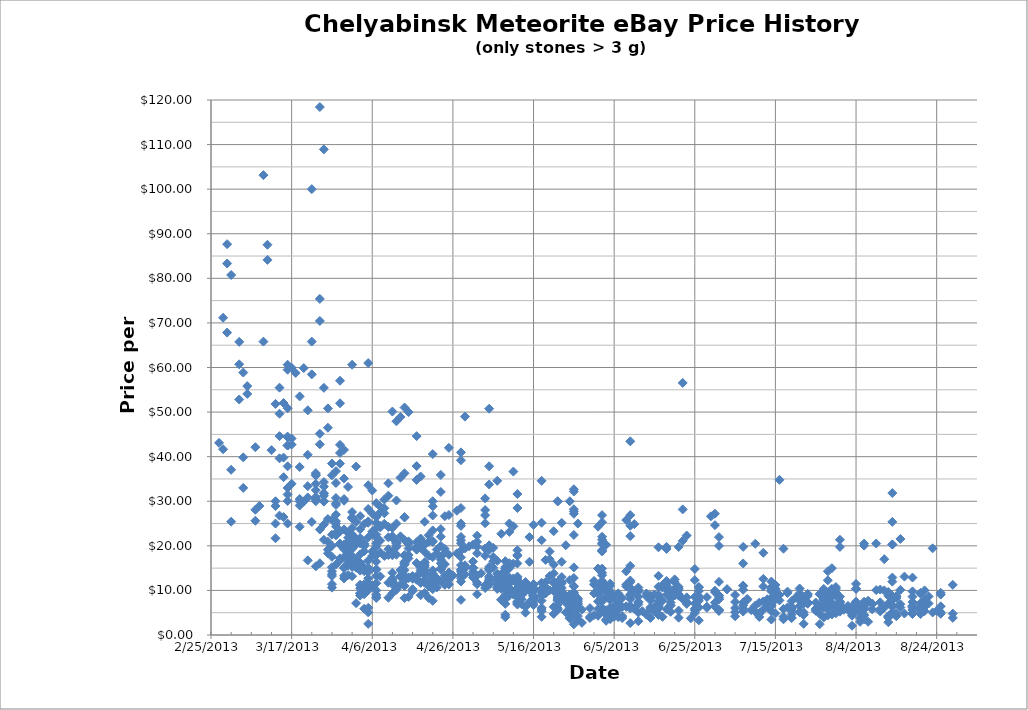
| Category | Series 0 |
|---|---|
| 41332.0 | 43.097 |
| 41333.0 | 71.156 |
| 41333.0 | 41.667 |
| 41334.0 | 83.333 |
| 41334.0 | 67.832 |
| 41334.0 | 87.663 |
| 41335.0 | 25.417 |
| 41335.0 | 37.064 |
| 41335.0 | 80.75 |
| 41337.0 | 52.827 |
| 41337.0 | 60.714 |
| 41337.0 | 65.748 |
| 41338.0 | 33 |
| 41338.0 | 39.845 |
| 41338.0 | 58.875 |
| 41339.0 | 55.833 |
| 41339.0 | 54.07 |
| 41341.0 | 42.125 |
| 41341.0 | 25.625 |
| 41341.0 | 28.083 |
| 41342.0 | 28.947 |
| 41343.0 | 103.148 |
| 41343.0 | 65.811 |
| 41344.0 | 84.142 |
| 41344.0 | 87.527 |
| 41345.0 | 41.46 |
| 41346.0 | 51.829 |
| 41346.0 | 21.696 |
| 41346.0 | 28.929 |
| 41346.0 | 25 |
| 41346.0 | 30 |
| 41347.0 | 39.634 |
| 41347.0 | 49.634 |
| 41347.0 | 44.603 |
| 41347.0 | 55.475 |
| 41347.0 | 26.782 |
| 41348.0 | 39.795 |
| 41348.0 | 26.452 |
| 41348.0 | 52.029 |
| 41348.0 | 35.395 |
| 41349.0 | 59.504 |
| 41349.0 | 30.065 |
| 41349.0 | 33 |
| 41349.0 | 44.5 |
| 41349.0 | 31.512 |
| 41349.0 | 50.85 |
| 41349.0 | 60.625 |
| 41349.0 | 42.5 |
| 41349.0 | 37.833 |
| 41349.0 | 44.375 |
| 41349.0 | 24.997 |
| 41349.0 | 42.5 |
| 41350.0 | 59.948 |
| 41350.0 | 33.919 |
| 41350.0 | 44.071 |
| 41350.0 | 42.71 |
| 41351.0 | 58.786 |
| 41352.0 | 29.046 |
| 41352.0 | 37.677 |
| 41352.0 | 30.5 |
| 41352.0 | 53.517 |
| 41352.0 | 29.96 |
| 41352.0 | 24.283 |
| 41353.0 | 59.859 |
| 41353.0 | 29.93 |
| 41354.0 | 16.735 |
| 41354.0 | 33.384 |
| 41354.0 | 40.423 |
| 41354.0 | 50.403 |
| 41354.0 | 30.849 |
| 41355.0 | 100 |
| 41355.0 | 65.809 |
| 41355.0 | 25.357 |
| 41355.0 | 58.462 |
| 41356.0 | 30.333 |
| 41356.0 | 35.901 |
| 41356.0 | 30.643 |
| 41356.0 | 30.011 |
| 41356.0 | 33.889 |
| 41356.0 | 30.964 |
| 41356.0 | 35.763 |
| 41356.0 | 32.5 |
| 41356.0 | 36.31 |
| 41356.0 | 15.4 |
| 41357.0 | 16.095 |
| 41357.0 | 23.65 |
| 41357.0 | 70.442 |
| 41357.0 | 75.392 |
| 41357.0 | 45.133 |
| 41357.0 | 118.421 |
| 41357.0 | 42.764 |
| 41358.0 | 29.923 |
| 41358.0 | 31.794 |
| 41358.0 | 33.291 |
| 41358.0 | 30.033 |
| 41358.0 | 21.357 |
| 41358.0 | 34.299 |
| 41358.0 | 55.435 |
| 41358.0 | 108.929 |
| 41358.0 | 31.231 |
| 41358.0 | 24.771 |
| 41358.0 | 31.786 |
| 41359.0 | 26.012 |
| 41359.0 | 50.821 |
| 41359.0 | 46.49 |
| 41359.0 | 19.131 |
| 41359.0 | 20.918 |
| 41359.0 | 18.316 |
| 41360.0 | 22.497 |
| 41360.0 | 38.462 |
| 41360.0 | 25.82 |
| 41360.0 | 11.404 |
| 41360.0 | 13.233 |
| 41360.0 | 35.823 |
| 41360.0 | 20 |
| 41360.0 | 17.537 |
| 41360.0 | 14.315 |
| 41360.0 | 10.625 |
| 41360.0 | 15.205 |
| 41360.0 | 13.651 |
| 41361.0 | 15.803 |
| 41361.0 | 29.167 |
| 41361.0 | 22.353 |
| 41361.0 | 25.521 |
| 41361.0 | 36.759 |
| 41361.0 | 22.917 |
| 41361.0 | 30.729 |
| 41361.0 | 26.984 |
| 41361.0 | 34.091 |
| 41361.0 | 24.309 |
| 41361.0 | 29.545 |
| 41361.0 | 25 |
| 41362.0 | 57.029 |
| 41362.0 | 38.441 |
| 41362.0 | 42.653 |
| 41362.0 | 23.211 |
| 41362.0 | 17.178 |
| 41362.0 | 40.831 |
| 41362.0 | 20.523 |
| 41362.0 | 20.478 |
| 41362.0 | 16.765 |
| 41362.0 | 20.255 |
| 41362.0 | 51.979 |
| 41363.0 | 30.5 |
| 41363.0 | 41.518 |
| 41363.0 | 13.275 |
| 41363.0 | 23.707 |
| 41363.0 | 15.196 |
| 41363.0 | 30.116 |
| 41363.0 | 12.68 |
| 41363.0 | 15 |
| 41363.0 | 20.303 |
| 41363.0 | 19.25 |
| 41363.0 | 35.093 |
| 41363.0 | 17.5 |
| 41364.0 | 16.85 |
| 41364.0 | 18.671 |
| 41364.0 | 13.453 |
| 41364.0 | 20.314 |
| 41364.0 | 22.908 |
| 41364.0 | 20.938 |
| 41364.0 | 16.125 |
| 41364.0 | 17.895 |
| 41364.0 | 20.414 |
| 41364.0 | 21.817 |
| 41364.0 | 20.413 |
| 41364.0 | 18.286 |
| 41364.0 | 19.052 |
| 41364.0 | 33.213 |
| 41364.0 | 15.633 |
| 41364.0 | 18.91 |
| 41365.0 | 26.279 |
| 41365.0 | 60.625 |
| 41365.0 | 22.586 |
| 41365.0 | 19.304 |
| 41365.0 | 26.122 |
| 41365.0 | 19.907 |
| 41365.0 | 24 |
| 41365.0 | 13.188 |
| 41365.0 | 26.412 |
| 41365.0 | 15.25 |
| 41365.0 | 17.75 |
| 41365.0 | 16.538 |
| 41365.0 | 20.278 |
| 41365.0 | 21.643 |
| 41365.0 | 27.579 |
| 41366.0 | 15.435 |
| 41366.0 | 15.082 |
| 41366.0 | 37.791 |
| 41366.0 | 25.352 |
| 41366.0 | 21.602 |
| 41366.0 | 20.335 |
| 41366.0 | 16.886 |
| 41366.0 | 20.297 |
| 41366.0 | 7.143 |
| 41367.0 | 20.538 |
| 41367.0 | 16.233 |
| 41367.0 | 15.2 |
| 41367.0 | 9.317 |
| 41367.0 | 21.769 |
| 41367.0 | 26.67 |
| 41367.0 | 10.469 |
| 41367.0 | 14.449 |
| 41367.0 | 15.278 |
| 41367.0 | 11.203 |
| 41367.0 | 11.236 |
| 41367.0 | 9.42 |
| 41367.0 | 23.72 |
| 41367.0 | 8.842 |
| 41367.0 | 15 |
| 41367.0 | 18.108 |
| 41368.0 | 18.788 |
| 41368.0 | 24.905 |
| 41368.0 | 15.174 |
| 41368.0 | 19.936 |
| 41368.0 | 10.774 |
| 41368.0 | 9.15 |
| 41368.0 | 14.315 |
| 41368.0 | 10.311 |
| 41368.0 | 11.375 |
| 41368.0 | 10.222 |
| 41368.0 | 10.156 |
| 41368.0 | 14.886 |
| 41368.0 | 20.278 |
| 41368.0 | 9.875 |
| 41368.0 | 10.375 |
| 41368.0 | 20.5 |
| 41368.0 | 20.437 |
| 41368.0 | 5.908 |
| 41369.0 | 10.062 |
| 41369.0 | 2.5 |
| 41369.0 | 10.964 |
| 41369.0 | 10.235 |
| 41369.0 | 15.057 |
| 41369.0 | 5.069 |
| 41369.0 | 6.102 |
| 41369.0 | 11 |
| 41369.0 | 14.167 |
| 41369.0 | 16.667 |
| 41369.0 | 61 |
| 41369.0 | 21.867 |
| 41369.0 | 28.261 |
| 41369.0 | 25.49 |
| 41369.0 | 33.596 |
| 41369.0 | 25.183 |
| 41369.0 | 11.722 |
| 41369.0 | 12.715 |
| 41370.0 | 27.256 |
| 41370.0 | 22.754 |
| 41370.0 | 18.738 |
| 41370.0 | 32.409 |
| 41370.0 | 23.193 |
| 41370.0 | 17.758 |
| 41370.0 | 11.062 |
| 41371.0 | 10 |
| 41371.0 | 8.303 |
| 41371.0 | 8.471 |
| 41371.0 | 9.022 |
| 41371.0 | 26.473 |
| 41371.0 | 20.571 |
| 41371.0 | 19.834 |
| 41371.0 | 22.53 |
| 41371.0 | 17.888 |
| 41371.0 | 16.459 |
| 41371.0 | 14.643 |
| 41371.0 | 13.212 |
| 41371.0 | 29.588 |
| 41371.0 | 25.142 |
| 41371.0 | 17.988 |
| 41371.0 | 14.749 |
| 41371.0 | 11.61 |
| 41371.0 | 21.872 |
| 41371.0 | 24.008 |
| 41372.0 | 18.495 |
| 41372.0 | 24.135 |
| 41372.0 | 27.5 |
| 41372.0 | 13.151 |
| 41372.0 | 21.163 |
| 41372.0 | 24.479 |
| 41372.0 | 28.78 |
| 41373.0 | 30.375 |
| 41373.0 | 28.425 |
| 41373.0 | 17.708 |
| 41373.0 | 24.943 |
| 41373.0 | 27.292 |
| 41374.0 | 17.933 |
| 41374.0 | 8.361 |
| 41374.0 | 11.724 |
| 41374.0 | 21.905 |
| 41374.0 | 19.248 |
| 41374.0 | 24.222 |
| 41374.0 | 31.25 |
| 41374.0 | 34.016 |
| 41375.0 | 17.884 |
| 41375.0 | 11.95 |
| 41375.0 | 18.726 |
| 41375.0 | 21.779 |
| 41375.0 | 12.054 |
| 41375.0 | 11.345 |
| 41375.0 | 9.368 |
| 41375.0 | 13.963 |
| 41375.0 | 12.701 |
| 41375.0 | 12.379 |
| 41375.0 | 24.034 |
| 41375.0 | 22.162 |
| 41375.0 | 50.115 |
| 41376.0 | 24.997 |
| 41376.0 | 19.759 |
| 41376.0 | 10.147 |
| 41376.0 | 18.011 |
| 41376.0 | 47.939 |
| 41376.0 | 20 |
| 41376.0 | 30.178 |
| 41376.0 | 20.67 |
| 41376.0 | 20.492 |
| 41376.0 | 10.925 |
| 41376.0 | 20.842 |
| 41377.0 | 48.918 |
| 41377.0 | 13.247 |
| 41377.0 | 14.578 |
| 41377.0 | 22.126 |
| 41377.0 | 13.2 |
| 41377.0 | 13.059 |
| 41377.0 | 11.305 |
| 41377.0 | 35.298 |
| 41378.0 | 16.232 |
| 41378.0 | 15.995 |
| 41378.0 | 13.02 |
| 41378.0 | 13.199 |
| 41378.0 | 12.201 |
| 41378.0 | 12.972 |
| 41378.0 | 26.357 |
| 41378.0 | 51.026 |
| 41378.0 | 36.273 |
| 41378.0 | 21.282 |
| 41378.0 | 14.54 |
| 41378.0 | 16.416 |
| 41378.0 | 17.794 |
| 41378.0 | 17.916 |
| 41378.0 | 26.462 |
| 41378.0 | 11.01 |
| 41378.0 | 12.727 |
| 41378.0 | 8.271 |
| 41378.0 | 15.769 |
| 41379.0 | 20.368 |
| 41379.0 | 12.932 |
| 41379.0 | 50 |
| 41379.0 | 17.188 |
| 41379.0 | 12.766 |
| 41379.0 | 21.006 |
| 41379.0 | 17.965 |
| 41379.0 | 8.553 |
| 41379.0 | 19.403 |
| 41380.0 | 12.617 |
| 41380.0 | 13.224 |
| 41380.0 | 12.888 |
| 41380.0 | 10.275 |
| 41380.0 | 9.834 |
| 41381.0 | 12.384 |
| 41381.0 | 19.375 |
| 41381.0 | 19.141 |
| 41381.0 | 44.604 |
| 41381.0 | 37.88 |
| 41381.0 | 19.722 |
| 41381.0 | 16.139 |
| 41381.0 | 20.806 |
| 41381.0 | 13.194 |
| 41381.0 | 34.785 |
| 41382.0 | 11.687 |
| 41382.0 | 8.913 |
| 41382.0 | 15.461 |
| 41382.0 | 19.578 |
| 41382.0 | 35.549 |
| 41382.0 | 15.102 |
| 41382.0 | 14.006 |
| 41382.0 | 11.865 |
| 41382.0 | 14.519 |
| 41382.0 | 21.638 |
| 41382.0 | 21.364 |
| 41383.0 | 16.327 |
| 41383.0 | 9.438 |
| 41383.0 | 16.129 |
| 41383.0 | 25.407 |
| 41383.0 | 18.644 |
| 41383.0 | 20.267 |
| 41383.0 | 11.713 |
| 41383.0 | 14.575 |
| 41383.0 | 13.479 |
| 41383.0 | 15.224 |
| 41383.0 | 13.837 |
| 41383.0 | 12.35 |
| 41383.0 | 15.625 |
| 41383.0 | 14.069 |
| 41384.0 | 17.747 |
| 41384.0 | 10.937 |
| 41384.0 | 12.059 |
| 41384.0 | 22.364 |
| 41384.0 | 8.3 |
| 41384.0 | 20.92 |
| 41385.0 | 23.462 |
| 41385.0 | 20.882 |
| 41385.0 | 7.666 |
| 41385.0 | 11.978 |
| 41385.0 | 12.55 |
| 41385.0 | 12.963 |
| 41385.0 | 10.288 |
| 41385.0 | 40.587 |
| 41385.0 | 28.862 |
| 41385.0 | 14.497 |
| 41385.0 | 13.137 |
| 41385.0 | 13.772 |
| 41385.0 | 21.078 |
| 41385.0 | 11.895 |
| 41385.0 | 13.043 |
| 41385.0 | 13.667 |
| 41385.0 | 26.806 |
| 41385.0 | 17.447 |
| 41385.0 | 29.997 |
| 41386.0 | 10.654 |
| 41386.0 | 18.25 |
| 41386.0 | 19.169 |
| 41386.0 | 12.727 |
| 41386.0 | 11.818 |
| 41387.0 | 14.783 |
| 41387.0 | 12.109 |
| 41387.0 | 22.051 |
| 41387.0 | 14.935 |
| 41387.0 | 14.696 |
| 41387.0 | 20 |
| 41387.0 | 16.082 |
| 41387.0 | 35.901 |
| 41387.0 | 32.094 |
| 41387.0 | 16.918 |
| 41387.0 | 23.75 |
| 41387.0 | 17.548 |
| 41388.0 | 26.645 |
| 41388.0 | 15.882 |
| 41388.0 | 19.318 |
| 41388.0 | 18.485 |
| 41388.0 | 13.357 |
| 41388.0 | 11.25 |
| 41389.0 | 41.975 |
| 41389.0 | 14 |
| 41389.0 | 12.465 |
| 41389.0 | 26.909 |
| 41389.0 | 11.349 |
| 41389.0 | 18 |
| 41390.0 | 13.34 |
| 41391.0 | 27.857 |
| 41391.0 | 18.319 |
| 41392.0 | 11.987 |
| 41392.0 | 13.25 |
| 41392.0 | 12.751 |
| 41392.0 | 21.995 |
| 41392.0 | 20.572 |
| 41392.0 | 17.433 |
| 41392.0 | 14.604 |
| 41392.0 | 14.225 |
| 41392.0 | 28.489 |
| 41392.0 | 39.2 |
| 41392.0 | 25.017 |
| 41392.0 | 40.963 |
| 41392.0 | 24.47 |
| 41392.0 | 18.91 |
| 41392.0 | 21.259 |
| 41392.0 | 7.879 |
| 41392.0 | 13.551 |
| 41392.0 | 14.67 |
| 41392.0 | 15.676 |
| 41393.0 | 48.991 |
| 41393.0 | 13.622 |
| 41393.0 | 14.981 |
| 41393.0 | 19.424 |
| 41393.0 | 15.636 |
| 41394.0 | 19.9 |
| 41395.0 | 15 |
| 41395.0 | 15.135 |
| 41395.0 | 13.519 |
| 41395.0 | 20.256 |
| 41395.0 | 16.483 |
| 41395.0 | 13.514 |
| 41395.0 | 14.179 |
| 41395.0 | 12.925 |
| 41395.0 | 15.094 |
| 41396.0 | 11.39 |
| 41396.0 | 22.273 |
| 41396.0 | 11.731 |
| 41396.0 | 13.333 |
| 41396.0 | 9.142 |
| 41396.0 | 18.333 |
| 41396.0 | 20.895 |
| 41396.0 | 19.785 |
| 41397.0 | 13.846 |
| 41398.0 | 30.632 |
| 41398.0 | 26.882 |
| 41398.0 | 11.149 |
| 41398.0 | 17.759 |
| 41398.0 | 25.069 |
| 41398.0 | 28.035 |
| 41398.0 | 19.403 |
| 41398.0 | 10.526 |
| 41399.0 | 20 |
| 41399.0 | 14.966 |
| 41399.0 | 14.523 |
| 41399.0 | 14.796 |
| 41399.0 | 13.146 |
| 41399.0 | 12.785 |
| 41399.0 | 11.465 |
| 41399.0 | 11.243 |
| 41399.0 | 12.365 |
| 41399.0 | 19.918 |
| 41399.0 | 12.182 |
| 41399.0 | 11.538 |
| 41399.0 | 15.271 |
| 41399.0 | 11.94 |
| 41399.0 | 19.103 |
| 41399.0 | 37.846 |
| 41399.0 | 20.123 |
| 41399.0 | 33.768 |
| 41399.0 | 50.758 |
| 41400.0 | 19.551 |
| 41400.0 | 16.552 |
| 41400.0 | 15.091 |
| 41400.0 | 17.5 |
| 41401.0 | 11.469 |
| 41401.0 | 10.326 |
| 41401.0 | 13.75 |
| 41401.0 | 34.594 |
| 41401.0 | 12.989 |
| 41401.0 | 12.44 |
| 41401.0 | 11.486 |
| 41401.0 | 16.613 |
| 41401.0 | 10.7 |
| 41402.0 | 22.695 |
| 41402.0 | 7.857 |
| 41402.0 | 11.8 |
| 41402.0 | 7.94 |
| 41402.0 | 11.383 |
| 41402.0 | 12.502 |
| 41402.0 | 13.725 |
| 41402.0 | 10.515 |
| 41402.0 | 11.619 |
| 41402.0 | 10.355 |
| 41403.0 | 10.497 |
| 41403.0 | 6.985 |
| 41403.0 | 7.972 |
| 41403.0 | 8.976 |
| 41403.0 | 10.304 |
| 41403.0 | 10.144 |
| 41403.0 | 3.988 |
| 41403.0 | 11.44 |
| 41403.0 | 14.306 |
| 41403.0 | 16.552 |
| 41403.0 | 13.362 |
| 41403.0 | 8.409 |
| 41403.0 | 8.414 |
| 41403.0 | 14.876 |
| 41403.0 | 12.835 |
| 41403.0 | 15.264 |
| 41403.0 | 12.56 |
| 41403.0 | 4.55 |
| 41404.0 | 10.278 |
| 41404.0 | 12.909 |
| 41404.0 | 8.85 |
| 41404.0 | 15.507 |
| 41404.0 | 16.105 |
| 41404.0 | 23.119 |
| 41404.0 | 10.32 |
| 41404.0 | 14.955 |
| 41404.0 | 10.612 |
| 41404.0 | 11.559 |
| 41404.0 | 25 |
| 41405.0 | 36.649 |
| 41405.0 | 24.374 |
| 41405.0 | 16.021 |
| 41405.0 | 9.07 |
| 41405.0 | 9.572 |
| 41405.0 | 12.691 |
| 41406.0 | 7.323 |
| 41406.0 | 12.285 |
| 41406.0 | 12.269 |
| 41406.0 | 8.7 |
| 41406.0 | 9.491 |
| 41406.0 | 17.761 |
| 41406.0 | 13.098 |
| 41406.0 | 31.617 |
| 41406.0 | 9.63 |
| 41406.0 | 11.887 |
| 41406.0 | 9.48 |
| 41406.0 | 19.01 |
| 41406.0 | 17.949 |
| 41406.0 | 28.482 |
| 41406.0 | 8.488 |
| 41406.0 | 11.512 |
| 41406.0 | 10.515 |
| 41406.0 | 16.05 |
| 41406.0 | 10.182 |
| 41406.0 | 12.746 |
| 41406.0 | 11.566 |
| 41406.0 | 6.842 |
| 41406.0 | 7.5 |
| 41406.0 | 9.919 |
| 41406.0 | 10.127 |
| 41406.0 | 10.411 |
| 41406.0 | 6.98 |
| 41407.0 | 10.151 |
| 41407.0 | 8.89 |
| 41407.0 | 6.923 |
| 41407.0 | 10.167 |
| 41407.0 | 11.325 |
| 41407.0 | 7.963 |
| 41408.0 | 10.373 |
| 41407.0 | 8.009 |
| 41408.0 | 9.819 |
| 41408.0 | 11.858 |
| 41408.0 | 6.32 |
| 41408.0 | 10.375 |
| 41408.0 | 9.939 |
| 41408.0 | 11.814 |
| 41408.0 | 5 |
| 41409.0 | 16.42 |
| 41409.0 | 21.958 |
| 41409.0 | 7.365 |
| 41409.0 | 10.556 |
| 41409.0 | 10.678 |
| 41409.0 | 10.826 |
| 41409.0 | 9.97 |
| 41410.0 | 24.719 |
| 41410.0 | 8.836 |
| 41410.0 | 9.933 |
| 41410.0 | 8.617 |
| 41410.0 | 8.224 |
| 41410.0 | 7.259 |
| 41410.0 | 6.709 |
| 41410.0 | 8.022 |
| 41410.0 | 7.902 |
| 41410.0 | 10.099 |
| 41410.0 | 11.297 |
| 41410.0 | 10.577 |
| 41410.0 | 8.83 |
| 41410.0 | 11.386 |
| 41410.0 | 8.252 |
| 41410.0 | 10.385 |
| 41412.0 | 25.191 |
| 41412.0 | 34.58 |
| 41412.0 | 9.593 |
| 41412.0 | 9.529 |
| 41412.0 | 5.832 |
| 41412.0 | 7.71 |
| 41412.0 | 10.392 |
| 41412.0 | 10.225 |
| 41412.0 | 21.25 |
| 41412.0 | 4.076 |
| 41412.0 | 8.77 |
| 41412.0 | 6.11 |
| 41412.0 | 5.334 |
| 41412.0 | 11.724 |
| 41413.0 | 16.842 |
| 41413.0 | 10.125 |
| 41413.0 | 10.469 |
| 41413.0 | 11.857 |
| 41413.0 | 9.41 |
| 41413.0 | 9.338 |
| 41413.0 | 10.694 |
| 41414.0 | 13.223 |
| 41414.0 | 10.028 |
| 41414.0 | 18.726 |
| 41414.0 | 17 |
| 41415.0 | 9.866 |
| 41415.0 | 12.017 |
| 41415.0 | 13.814 |
| 41415.0 | 15.787 |
| 41415.0 | 11.676 |
| 41415.0 | 10.15 |
| 41415.0 | 4.724 |
| 41415.0 | 6.302 |
| 41415.0 | 23.273 |
| 41416.0 | 7.713 |
| 41416.0 | 30 |
| 41416.0 | 10.168 |
| 41416.0 | 11.758 |
| 41416.0 | 11.875 |
| 41416.0 | 10.294 |
| 41416.0 | 9.875 |
| 41416.0 | 10.08 |
| 41416.0 | 5.641 |
| 41416.0 | 6.749 |
| 41416.0 | 8.305 |
| 41416.0 | 9.237 |
| 41416.0 | 8.523 |
| 41416.0 | 29.959 |
| 41416.0 | 9.276 |
| 41416.0 | 7.911 |
| 41416.0 | 11.706 |
| 41416.0 | 6 |
| 41416.0 | 8.296 |
| 41417.0 | 25.147 |
| 41417.0 | 16.41 |
| 41417.0 | 9.031 |
| 41417.0 | 11.86 |
| 41417.0 | 9.581 |
| 41417.0 | 9.737 |
| 41417.0 | 8.417 |
| 41417.0 | 11.589 |
| 41417.0 | 13 |
| 41417.0 | 10.545 |
| 41417.0 | 8.049 |
| 41417.0 | 9.473 |
| 41418.0 | 5.071 |
| 41418.0 | 20.136 |
| 41418.0 | 8.74 |
| 41418.0 | 7.243 |
| 41418.0 | 7.335 |
| 41419.0 | 8.884 |
| 41419.0 | 6.664 |
| 41419.0 | 7.454 |
| 41419.0 | 8.53 |
| 41419.0 | 12.313 |
| 41419.0 | 6.124 |
| 41419.0 | 9.054 |
| 41419.0 | 7.679 |
| 41419.0 | 4.745 |
| 41419.0 | 5.469 |
| 41419.0 | 3.706 |
| 41419.0 | 5.065 |
| 41419.0 | 3.77 |
| 41419.0 | 30 |
| 41420.0 | 2.383 |
| 41420.0 | 7.482 |
| 41420.0 | 7.473 |
| 41420.0 | 8.962 |
| 41420.0 | 9.351 |
| 41420.0 | 10.971 |
| 41420.0 | 9.583 |
| 41420.0 | 7.361 |
| 41420.0 | 7.265 |
| 41420.0 | 10.887 |
| 41420.0 | 15.159 |
| 41420.0 | 4.714 |
| 41420.0 | 27.715 |
| 41420.0 | 27.204 |
| 41420.0 | 28.218 |
| 41420.0 | 22.449 |
| 41420.0 | 32.187 |
| 41420.0 | 32.691 |
| 41420.0 | 12.788 |
| 41421.0 | 8.192 |
| 41421.0 | 24.991 |
| 41421.0 | 3.438 |
| 41421.0 | 4.234 |
| 41421.0 | 5.987 |
| 41421.0 | 6.006 |
| 41421.0 | 6.933 |
| 41421.0 | 7.875 |
| 41421.0 | 7.102 |
| 41421.0 | 7.517 |
| 41422.0 | 2.735 |
| 41422.0 | 5.68 |
| 41424.0 | 6.028 |
| 41424.0 | 4.062 |
| 41424.0 | 3.81 |
| 41425.0 | 4.472 |
| 41425.0 | 9.325 |
| 41425.0 | 12.129 |
| 41425.0 | 11.364 |
| 41426.0 | 4.312 |
| 41426.0 | 24.291 |
| 41426.0 | 7.551 |
| 41426.0 | 9.18 |
| 41426.0 | 10.127 |
| 41426.0 | 14.902 |
| 41426.0 | 5.826 |
| 41427.0 | 7.799 |
| 41427.0 | 10.967 |
| 41427.0 | 7.969 |
| 41427.0 | 6.088 |
| 41427.0 | 7.5 |
| 41427.0 | 25.294 |
| 41427.0 | 13.956 |
| 41427.0 | 26.887 |
| 41427.0 | 22.04 |
| 41427.0 | 5.366 |
| 41427.0 | 10.693 |
| 41427.0 | 11.869 |
| 41427.0 | 10.658 |
| 41427.0 | 11.088 |
| 41427.0 | 14.886 |
| 41427.0 | 10.032 |
| 41427.0 | 11.957 |
| 41427.0 | 21.362 |
| 41427.0 | 20.4 |
| 41427.0 | 18.75 |
| 41427.0 | 20.614 |
| 41427.0 | 13.408 |
| 41427.0 | 18.943 |
| 41427.0 | 19.034 |
| 41427.0 | 12.127 |
| 41427.0 | 11.544 |
| 41428.0 | 10.384 |
| 41428.0 | 10.33 |
| 41428.0 | 10.884 |
| 41428.0 | 4.58 |
| 41428.0 | 20.227 |
| 41428.0 | 3.443 |
| 41428.0 | 3.184 |
| 41428.0 | 5.552 |
| 41428.0 | 8.585 |
| 41428.0 | 9.69 |
| 41429.0 | 8 |
| 41429.0 | 11.518 |
| 41429.0 | 8.698 |
| 41429.0 | 7.854 |
| 41429.0 | 11.038 |
| 41429.0 | 9.84 |
| 41429.0 | 5 |
| 41429.0 | 9.105 |
| 41429.0 | 3.661 |
| 41429.0 | 3.583 |
| 41429.0 | 6.114 |
| 41430.0 | 4.077 |
| 41430.0 | 5.078 |
| 41430.0 | 5.73 |
| 41430.0 | 6.468 |
| 41430.0 | 8.571 |
| 41431.0 | 5.684 |
| 41431.0 | 9.333 |
| 41431.0 | 6.491 |
| 41431.0 | 5.76 |
| 41431.0 | 6.014 |
| 41431.0 | 7.21 |
| 41431.0 | 7.416 |
| 41431.0 | 6.042 |
| 41431.0 | 4.013 |
| 41432.0 | 6.287 |
| 41432.0 | 3.804 |
| 41432.0 | 4.248 |
| 41432.0 | 8.294 |
| 41433.0 | 10.913 |
| 41433.0 | 6.431 |
| 41433.0 | 25.789 |
| 41433.0 | 11.299 |
| 41433.0 | 14.279 |
| 41433.0 | 6.317 |
| 41434.0 | 2.679 |
| 41434.0 | 15.498 |
| 41434.0 | 8.072 |
| 41434.0 | 6.605 |
| 41434.0 | 24.508 |
| 41434.0 | 5.953 |
| 41434.0 | 8.841 |
| 41434.0 | 43.445 |
| 41434.0 | 22.186 |
| 41434.0 | 10.234 |
| 41434.0 | 10.617 |
| 41434.0 | 11.861 |
| 41434.0 | 9.104 |
| 41434.0 | 26.896 |
| 41434.0 | 12.219 |
| 41435.0 | 5.899 |
| 41435.0 | 24.878 |
| 41435.0 | 9.85 |
| 41436.0 | 9.865 |
| 41436.0 | 10.131 |
| 41436.0 | 3.098 |
| 41436.0 | 5.035 |
| 41436.0 | 7.465 |
| 41436.0 | 7.338 |
| 41436.0 | 8.611 |
| 41436.0 | 6.864 |
| 41436.0 | 10.658 |
| 41437.0 | 5.332 |
| 41438.0 | 4.563 |
| 41438.0 | 9.309 |
| 41438.0 | 8.673 |
| 41439.0 | 5.849 |
| 41439.0 | 6.189 |
| 41439.0 | 3.832 |
| 41439.0 | 7.765 |
| 41439.0 | 8.219 |
| 41439.0 | 8.849 |
| 41440.0 | 5.224 |
| 41440.0 | 6.377 |
| 41440.0 | 6.135 |
| 41440.0 | 9.086 |
| 41441.0 | 8.751 |
| 41441.0 | 9.031 |
| 41441.0 | 7.576 |
| 41441.0 | 5.974 |
| 41441.0 | 6.125 |
| 41441.0 | 4.752 |
| 41441.0 | 6.436 |
| 41441.0 | 4.483 |
| 41441.0 | 6.687 |
| 41441.0 | 13.281 |
| 41441.0 | 19.677 |
| 41441.0 | 10.833 |
| 41442.0 | 10.624 |
| 41442.0 | 7.701 |
| 41442.0 | 11.039 |
| 41442.0 | 11.226 |
| 41442.0 | 4.083 |
| 41443.0 | 10.291 |
| 41443.0 | 11.993 |
| 41443.0 | 5.763 |
| 41443.0 | 19.299 |
| 41443.0 | 12.131 |
| 41443.0 | 11.567 |
| 41443.0 | 9.039 |
| 41443.0 | 11.132 |
| 41443.0 | 19.774 |
| 41444.0 | 8.184 |
| 41444.0 | 6.701 |
| 41444.0 | 5.203 |
| 41444.0 | 6.586 |
| 41444.0 | 10 |
| 41444.0 | 7.29 |
| 41445.0 | 12.475 |
| 41445.0 | 8.841 |
| 41445.0 | 9.966 |
| 41445.0 | 11.904 |
| 41445.0 | 10.405 |
| 41446.0 | 8.823 |
| 41446.0 | 3.888 |
| 41446.0 | 5.485 |
| 41446.0 | 10.09 |
| 41446.0 | 9.167 |
| 41446.0 | 19.753 |
| 41446.0 | 10.374 |
| 41446.0 | 10.8 |
| 41447.0 | 21.109 |
| 41447.0 | 56.541 |
| 41447.0 | 28.169 |
| 41447.0 | 8.076 |
| 41448.0 | 8.429 |
| 41448.0 | 22.314 |
| 41448.0 | 7.28 |
| 41448.0 | 7.389 |
| 41448.0 | 6.972 |
| 41449.0 | 3.731 |
| 41450.0 | 7.066 |
| 41450.0 | 5.541 |
| 41450.0 | 4.905 |
| 41450.0 | 5.903 |
| 41450.0 | 8.537 |
| 41450.0 | 12.311 |
| 41450.0 | 14.812 |
| 41451.0 | 7.661 |
| 41451.0 | 10.639 |
| 41451.0 | 8.109 |
| 41451.0 | 9.858 |
| 41451.0 | 10.77 |
| 41451.0 | 8.727 |
| 41451.0 | 6.193 |
| 41451.0 | 3.284 |
| 41453.0 | 8.485 |
| 41453.0 | 6.366 |
| 41453.0 | 6.101 |
| 41454.0 | 26.622 |
| 41455.0 | 27.202 |
| 41455.0 | 7.249 |
| 41455.0 | 9.615 |
| 41455.0 | 9.951 |
| 41455.0 | 24.635 |
| 406697.0 | 25.064 |
| 41455.0 | 6.428 |
| 41455.0 | 6.393 |
| 41456.0 | 11.92 |
| 41456.0 | 8.875 |
| 41456.0 | 8.887 |
| 41456.0 | 8.061 |
| 41456.0 | 21.967 |
| 41456.0 | 20 |
| 41456.0 | 8.486 |
| 41456.0 | 8.03 |
| 41456.0 | 5.662 |
| 41456.0 | 5.532 |
| 41456.0 | 5.384 |
| 41458.0 | 10.237 |
| 41458.0 | 10.276 |
| 41460.0 | 7.412 |
| 41460.0 | 6.036 |
| 41460.0 | 4.2 |
| 41460.0 | 8.992 |
| 41460.0 | 5.135 |
| 41462.0 | 7.328 |
| 41462.0 | 11.036 |
| 41462.0 | 16.049 |
| 41462.0 | 10.132 |
| 41462.0 | 5.259 |
| 41462.0 | 5.956 |
| 41462.0 | 11.058 |
| 41462.0 | 19.767 |
| 41462.0 | 6.636 |
| 41463.0 | 8.1 |
| 41463.0 | 7.887 |
| 41464.0 | 5.593 |
| 41465.0 | 20.468 |
| 41465.0 | 5.245 |
| 41465.0 | 6.588 |
| 41466.0 | 7.255 |
| 41466.0 | 4.758 |
| 41466.0 | 4.905 |
| 41466.0 | 4.047 |
| 41467.0 | 18.44 |
| 41467.0 | 10.893 |
| 41467.0 | 12.583 |
| 41467.0 | 7.535 |
| 41467.0 | 5.699 |
| 41468.0 | 6.255 |
| 41468.0 | 6.952 |
| 41468.0 | 7.345 |
| 41468.0 | 7.066 |
| 41468.0 | 8.005 |
| 41468.0 | 6.572 |
| 41469.0 | 9.783 |
| 41469.0 | 10.304 |
| 41469.0 | 8.267 |
| 41469.0 | 7.111 |
| 41469.0 | 6.696 |
| 41469.0 | 10.417 |
| 41469.0 | 10.748 |
| 41469.0 | 6.53 |
| 41469.0 | 5.342 |
| 41469.0 | 11.982 |
| 41469.0 | 3.462 |
| 41469.0 | 5.434 |
| 41469.0 | 6.551 |
| 41470.0 | 9.664 |
| 41470.0 | 4.845 |
| 41470.0 | 10.292 |
| 41470.0 | 7.979 |
| 41470.0 | 11.216 |
| 41470.0 | 10.4 |
| 41470.0 | 9.506 |
| 41471.0 | 34.808 |
| 41471.0 | 8.995 |
| 41471.0 | 7.751 |
| 41472.0 | 19.355 |
| 41472.0 | 3.525 |
| 41472.0 | 4.106 |
| 41472.0 | 5.86 |
| 41473.0 | 9.403 |
| 41473.0 | 6.181 |
| 41473.0 | 9.737 |
| 41474.0 | 7.581 |
| 41474.0 | 5.833 |
| 41474.0 | 4.593 |
| 41474.0 | 3.906 |
| 41474.0 | 6.147 |
| 41474.0 | 5.45 |
| 41474.0 | 3.777 |
| 41474.0 | 5.872 |
| 41474.0 | 5.991 |
| 41474.0 | 6.344 |
| 41475.0 | 8.377 |
| 41476.0 | 8.9 |
| 41476.0 | 6.514 |
| 41476.0 | 5.134 |
| 41476.0 | 10.431 |
| 41476.0 | 9.357 |
| 41476.0 | 7.726 |
| 41476.0 | 5.135 |
| 41477.0 | 4.5 |
| 41477.0 | 2.504 |
| 41477.0 | 5.086 |
| 41477.0 | 7.039 |
| 41477.0 | 8.4 |
| 41477.0 | 4.584 |
| 41478.0 | 7.015 |
| 41478.0 | 8.733 |
| 41478.0 | 7.353 |
| 41478.0 | 9 |
| 41478.0 | 9.216 |
| 41480.0 | 7.282 |
| 41480.0 | 5.591 |
| 41480.0 | 5.435 |
| 41480.0 | 5.889 |
| 41481.0 | 9.2 |
| 41481.0 | 5.8 |
| 41481.0 | 4.724 |
| 41481.0 | 6.777 |
| 41481.0 | 9.121 |
| 41481.0 | 2.443 |
| 41482.0 | 8.576 |
| 41482.0 | 3.945 |
| 41482.0 | 6.113 |
| 41482.0 | 6.357 |
| 41482.0 | 9.204 |
| 41482.0 | 6.242 |
| 41482.0 | 10.34 |
| 41482.0 | 8.715 |
| 41482.0 | 8.096 |
| 41482.0 | 8.26 |
| 41482.0 | 7.961 |
| 41482.0 | 8.048 |
| 41482.0 | 7.998 |
| 41483.0 | 14.286 |
| 41483.0 | 12.269 |
| 41483.0 | 6.471 |
| 41483.0 | 5.843 |
| 41483.0 | 7.532 |
| 41483.0 | 4.404 |
| 41483.0 | 9.394 |
| 41483.0 | 7.129 |
| 41484.0 | 14.995 |
| 41484.0 | 4.6 |
| 41484.0 | 8.763 |
| 41484.0 | 10.345 |
| 41484.0 | 6.904 |
| 41484.0 | 6.71 |
| 41484.0 | 6.633 |
| 41484.0 | 7.227 |
| 41484.0 | 6.667 |
| 41484.0 | 6.788 |
| 41485.0 | 4.889 |
| 41485.0 | 5.278 |
| 41485.0 | 6.429 |
| 41485.0 | 10.754 |
| 41485.0 | 8.743 |
| 41485.0 | 10.338 |
| 41485.0 | 9.541 |
| 41486.0 | 7.258 |
| 41486.0 | 8.598 |
| 41486.0 | 6.935 |
| 41486.0 | 6.477 |
| 41486.0 | 7.543 |
| 41486.0 | 5.246 |
| 41486.0 | 21.362 |
| 41486.0 | 19.753 |
| 41487.0 | 5.672 |
| 41488.0 | 6.061 |
| 41488.0 | 5.625 |
| 41488.0 | 5.909 |
| 41488.0 | 6.519 |
| 41488.0 | 5.989 |
| 41489.0 | 4.79 |
| 41489.0 | 5.055 |
| 41489.0 | 4.891 |
| 41489.0 | 4.32 |
| 41489.0 | 5.361 |
| 41489.0 | 2.075 |
| 41489.0 | 6.425 |
| 41490.0 | 7.479 |
| 41490.0 | 6.277 |
| 41490.0 | 6.963 |
| 41490.0 | 5.766 |
| 41490.0 | 11.465 |
| 41490.0 | 10.35 |
| 41490.0 | 10.377 |
| 41491.0 | 3.812 |
| 41491.0 | 4.851 |
| 41491.0 | 5.372 |
| 41491.0 | 2.963 |
| 41491.0 | 5.862 |
| 41492.0 | 20.513 |
| 41492.0 | 5.755 |
| 41492.0 | 4.358 |
| 41492.0 | 4.509 |
| 41492.0 | 3.515 |
| 41492.0 | 20.056 |
| 41492.0 | 6.591 |
| 41492.0 | 7.107 |
| 41492.0 | 6.62 |
| 41492.0 | 6.264 |
| 41492.0 | 7.463 |
| 41493.0 | 7.675 |
| 41493.0 | 2.969 |
| 41494.0 | 6.963 |
| 41494.0 | 7.071 |
| 41494.0 | 5.765 |
| 41494.0 | 6.983 |
| 41495.0 | 10.067 |
| 41495.0 | 20.52 |
| 41496.0 | 7.333 |
| 41496.0 | 5.296 |
| 41496.0 | 10.196 |
| 41496.0 | 5.861 |
| 41497.0 | 6.127 |
| 41497.0 | 10 |
| 41497.0 | 17.001 |
| 41498.0 | 2.869 |
| 41498.0 | 3.887 |
| 41498.0 | 4.278 |
| 41498.0 | 7.075 |
| 41498.0 | 4.139 |
| 41498.0 | 8.757 |
| 41498.0 | 9.639 |
| 41499.0 | 25.373 |
| 41499.0 | 5.071 |
| 41499.0 | 6.49 |
| 41499.0 | 20.308 |
| 41499.0 | 31.833 |
| 41499.0 | 20.292 |
| 41499.0 | 12.885 |
| 41499.0 | 11.974 |
| 41499.0 | 8.452 |
| 41499.0 | 7.812 |
| 41499.0 | 6.301 |
| 41499.0 | 6.682 |
| 41499.0 | 8.793 |
| 41500.0 | 8.723 |
| 41500.0 | 8.709 |
| 41500.0 | 8.3 |
| 41500.0 | 4.227 |
| 41500.0 | 4.848 |
| 41500.0 | 4.27 |
| 41501.0 | 10.127 |
| 41501.0 | 6.898 |
| 41501.0 | 6.169 |
| 41501.0 | 21.537 |
| 41502.0 | 13.102 |
| 41502.0 | 4.818 |
| 41504.0 | 8.605 |
| 41504.0 | 6.561 |
| 41504.0 | 9.784 |
| 41504.0 | 12.887 |
| 41504.0 | 6.406 |
| 41504.0 | 7.393 |
| 41504.0 | 4.894 |
| 41504.0 | 5.625 |
| 41504.0 | 6.15 |
| 41504.0 | 4.704 |
| 41506.0 | 6.093 |
| 41506.0 | 7.011 |
| 41506.0 | 5.451 |
| 41506.0 | 4.707 |
| 41506.0 | 9.458 |
| 41506.0 | 5.911 |
| 41506.0 | 7.124 |
| 41506.0 | 5.982 |
| 41506.0 | 5.858 |
| 41506.0 | 5.534 |
| 41506.0 | 9.264 |
| 41507.0 | 5.35 |
| 41507.0 | 10 |
| 41507.0 | 6.3 |
| 41507.0 | 7.987 |
| 41508.0 | 7.064 |
| 41508.0 | 8.654 |
| 41509.0 | 5.059 |
| 41509.0 | 19.444 |
| 41510.0 | 5.4 |
| 41511.0 | 9.059 |
| 41511.0 | 6.438 |
| 41511.0 | 4.767 |
| 41511.0 | 9.467 |
| 41511.0 | 5.121 |
| 41514.0 | 11.25 |
| 41514.0 | 3.839 |
| 41514.0 | 4.799 |